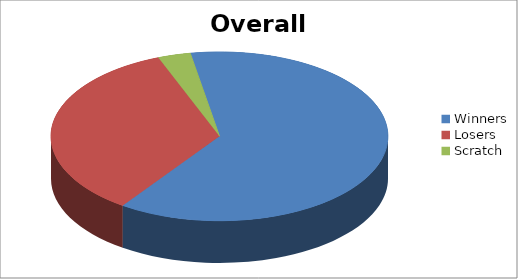
| Category | Series 1 |
|---|---|
| Winners | 20 |
| Losers | 11 |
| Scratch | 1 |